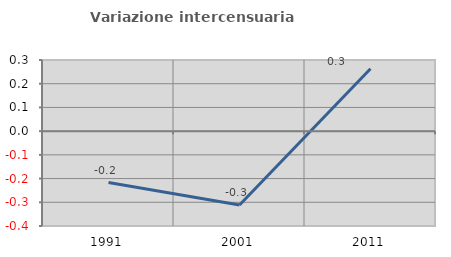
| Category | Variazione intercensuaria annua |
|---|---|
| 1991.0 | -0.217 |
| 2001.0 | -0.312 |
| 2011.0 | 0.263 |